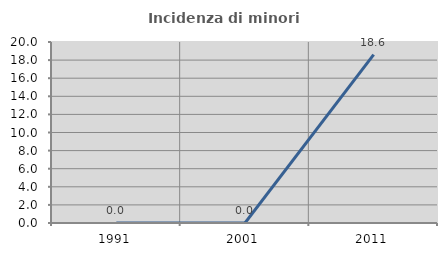
| Category | Incidenza di minori stranieri |
|---|---|
| 1991.0 | 0 |
| 2001.0 | 0 |
| 2011.0 | 18.605 |